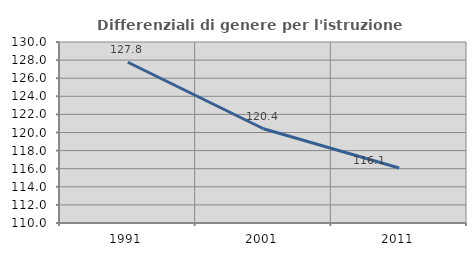
| Category | Differenziali di genere per l'istruzione superiore |
|---|---|
| 1991.0 | 127.765 |
| 2001.0 | 120.413 |
| 2011.0 | 116.084 |